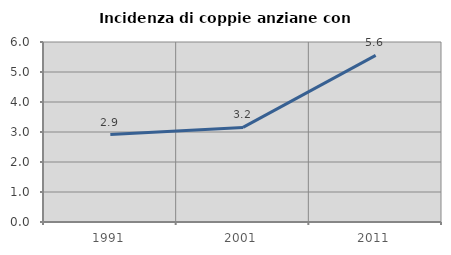
| Category | Incidenza di coppie anziane con figli |
|---|---|
| 1991.0 | 2.913 |
| 2001.0 | 3.153 |
| 2011.0 | 5.556 |